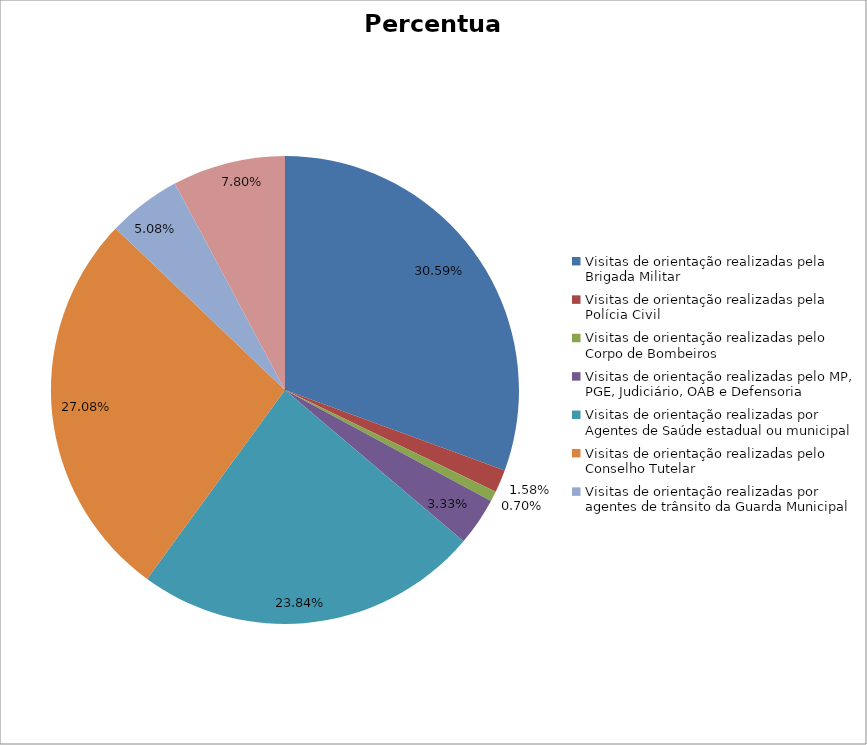
| Category | Percentual |
|---|---|
| Visitas de orientação realizadas pela Brigada Militar | 0.306 |
| Visitas de orientação realizadas pela Polícia Civil | 0.016 |
| Visitas de orientação realizadas pelo Corpo de Bombeiros | 0.007 |
| Visitas de orientação realizadas pelo MP, PGE, Judiciário, OAB e Defensoria | 0.033 |
| Visitas de orientação realizadas por Agentes de Saúde estadual ou municipal | 0.238 |
| Visitas de orientação realizadas pelo Conselho Tutelar | 0.271 |
| Visitas de orientação realizadas por agentes de trânsito da Guarda Municipal | 0.051 |
| Visitas de orientação realizadas por ONGs, entidades privadas, CRAS e CREAS | 0.078 |